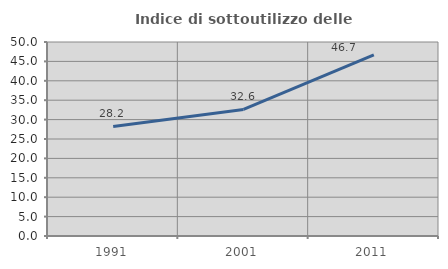
| Category | Indice di sottoutilizzo delle abitazioni  |
|---|---|
| 1991.0 | 28.249 |
| 2001.0 | 32.609 |
| 2011.0 | 46.711 |